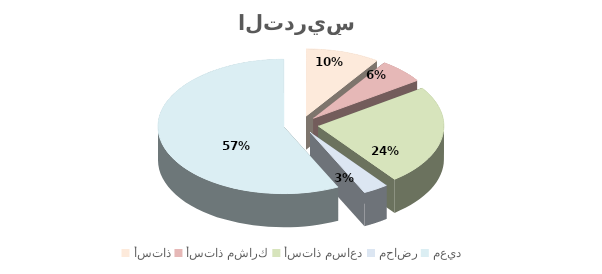
| Category | Series 0 |
|---|---|
| أستاذ | 16.667 |
| أستاذ مشارك | 10.405 |
| أستاذ مساعد | 42.26 |
| محاضر | 5.73 |
| معيد | 100 |